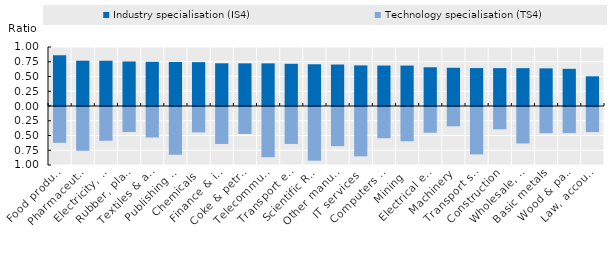
| Category | Technology specialisation (TS4) | Industry specialisation (IS4) |
|---|---|---|
| Food products | -0.607 | 0.86 |
| Pharmaceuticals | -0.742 | 0.768 |
| Electricity, gas & steam | -0.572 | 0.767 |
| Rubber, plastics, minerals | -0.424 | 0.755 |
| Textiles & apparel | -0.517 | 0.749 |
| Publishing & broadcasting | -0.809 | 0.746 |
| Chemicals | -0.431 | 0.743 |
| Finance & insurance | -0.627 | 0.724 |
| Coke & petroleum | -0.456 | 0.723 |
| Telecommunications | -0.851 | 0.722 |
| Transport equipment | -0.626 | 0.715 |
| Scientific R&D | -0.91 | 0.708 |
| Other manufactures | -0.664 | 0.703 |
| IT services | -0.837 | 0.688 |
| Computers & electronics | -0.529 | 0.686 |
| Mining | -0.581 | 0.685 |
| Electrical equipment | -0.436 | 0.656 |
| Machinery | -0.329 | 0.648 |
| Transport services | -0.804 | 0.643 |
| Construction | -0.377 | 0.642 |
| Wholesale, retail, repairs | -0.619 | 0.641 |
| Basic metals | -0.445 | 0.638 |
| Wood & paper | -0.442 | 0.63 |
| Law, accountancy & eng. | -0.426 | 0.503 |